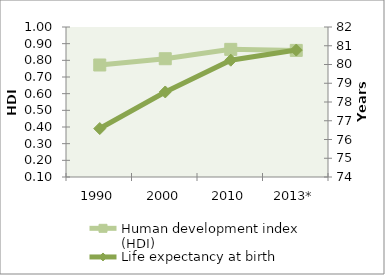
| Category | Human development index (HDI) |
|---|---|
| 1990 | 0.772 |
| 2000 | 0.81 |
| 2010 | 0.866 |
| 2013* | 0.86 |